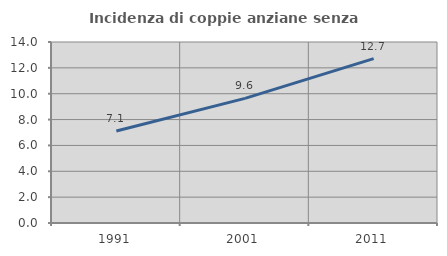
| Category | Incidenza di coppie anziane senza figli  |
|---|---|
| 1991.0 | 7.119 |
| 2001.0 | 9.639 |
| 2011.0 | 12.714 |